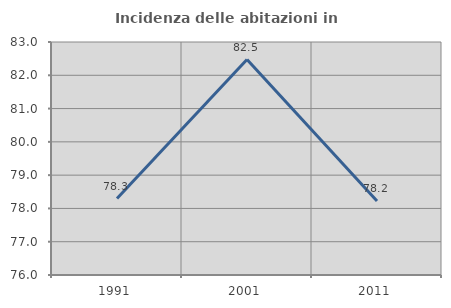
| Category | Incidenza delle abitazioni in proprietà  |
|---|---|
| 1991.0 | 78.297 |
| 2001.0 | 82.474 |
| 2011.0 | 78.224 |